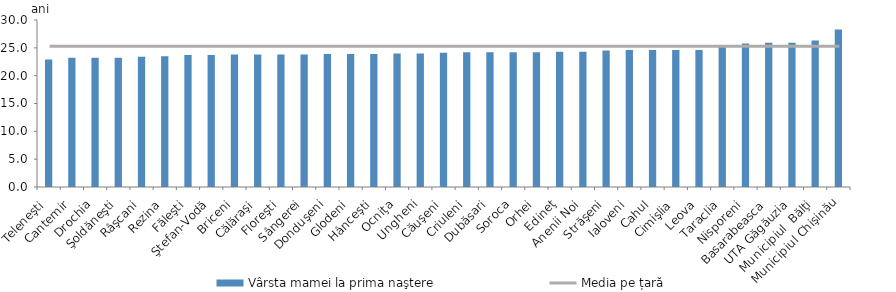
| Category | Vârsta mamei la prima naştere |
|---|---|
| Teleneşti | 22.9 |
| Cantemir | 23.2 |
| Drochia | 23.2 |
| Şoldăneşti | 23.2 |
| Râşcani | 23.4 |
| Rezina | 23.5 |
| Făleşti | 23.7 |
| Ştefan-Vodă | 23.7 |
| Briceni | 23.8 |
| Călăraşi | 23.8 |
| Floreşti | 23.8 |
| Sângerei | 23.8 |
| Donduşeni | 23.9 |
| Glodeni | 23.9 |
| Hânceşti | 23.9 |
| Ocniţa | 24 |
| Ungheni | 24 |
| Căuşeni | 24.1 |
| Criuleni | 24.2 |
| Dubăsari | 24.2 |
| Soroca | 24.2 |
| Orhei | 24.2 |
| Edineţ | 24.3 |
| Anenii Noi | 24.3 |
| Străşeni | 24.5 |
| Ialoveni | 24.6 |
| Cahul | 24.6 |
| Cimişlia | 24.6 |
| Leova | 24.6 |
| Taraclia | 25.2 |
| Nisporeni | 25.8 |
| Basarabeasca | 25.9 |
| UTA Găgăuzia | 25.9 |
| Municipiul  Bălţi | 26.3 |
| Municipiul Chişinău | 28.3 |